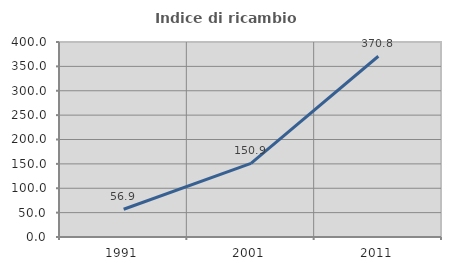
| Category | Indice di ricambio occupazionale  |
|---|---|
| 1991.0 | 56.863 |
| 2001.0 | 150.926 |
| 2011.0 | 370.769 |